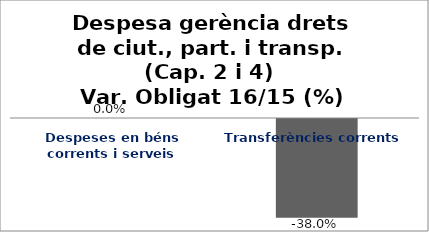
| Category | Series 0 |
|---|---|
| Despeses en béns corrents i serveis | 0 |
| Transferències corrents | -0.38 |